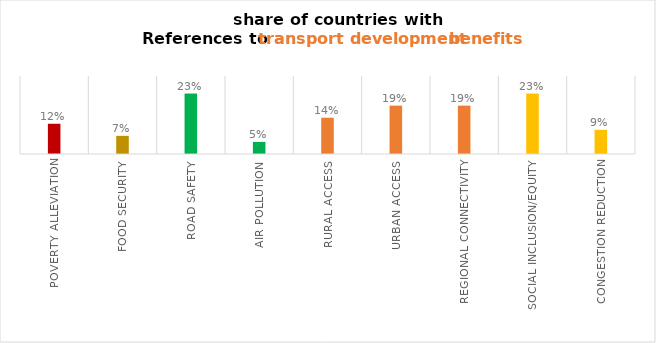
| Category | Series 0 |
|---|---|
| Poverty Alleviation | 0.116 |
| Food Security | 0.07 |
| Road Safety | 0.233 |
| Air Pollution | 0.047 |
| Rural Access | 0.14 |
| Urban Access | 0.186 |
| Regional Connectivity | 0.186 |
| Social Inclusion/Equity | 0.233 |
| Congestion Reduction | 0.093 |